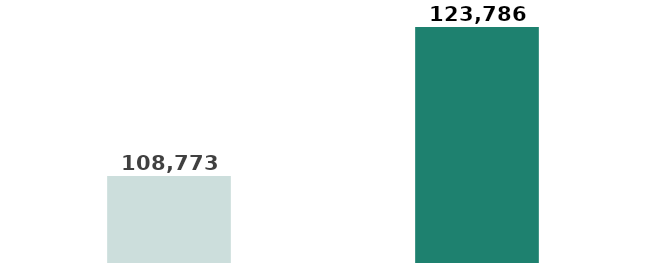
| Category | Series 0 |
|---|---|
| حتى الربع الرابع 2023م | 108772.596 |
| حتى الربع الرابع 2022م | 123785.533 |